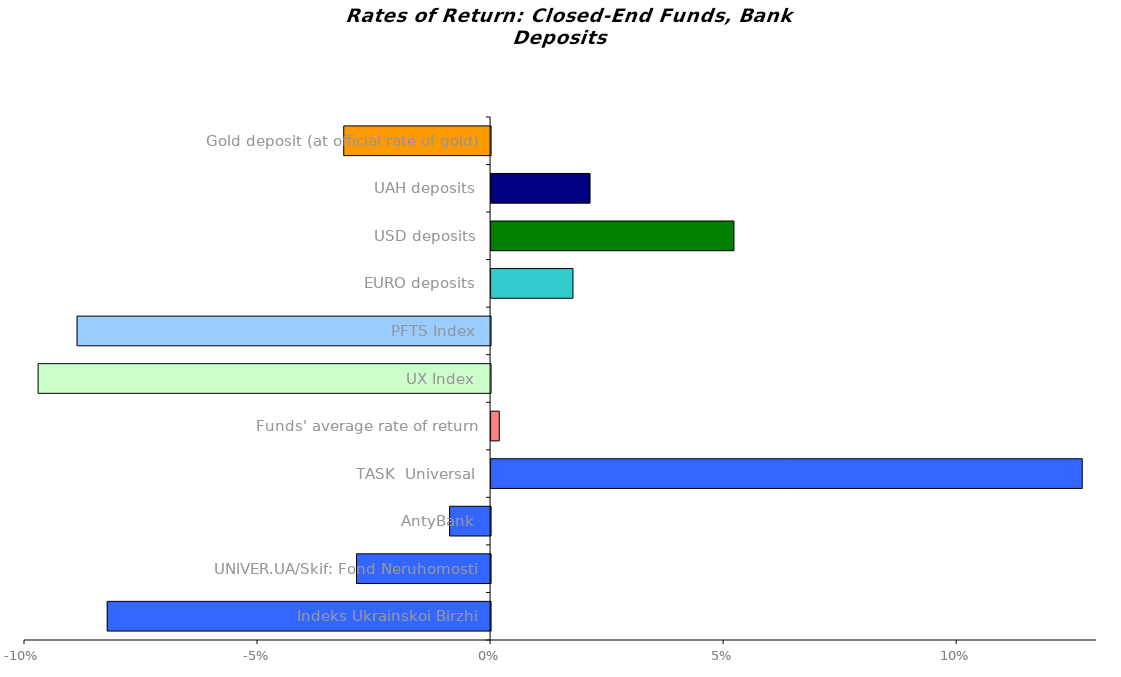
| Category | Series 0 |
|---|---|
| Indeks Ukrainskoi Birzhi | -0.082 |
| UNIVER.UA/Skif: Fond Neruhomosti | -0.029 |
| AntyBank | -0.009 |
| TASK  Universal | 0.127 |
| Funds' average rate of return | 0.002 |
| UX Index | -0.097 |
| PFTS Index | -0.089 |
| EURO deposits | 0.018 |
| USD deposits | 0.052 |
| UAH deposits | 0.021 |
| Gold deposit (at official rate of gold) | -0.032 |